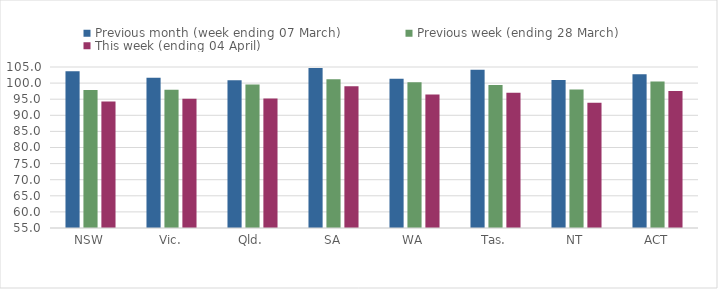
| Category | Previous month (week ending 07 March) | Previous week (ending 28 March) | This week (ending 04 April) |
|---|---|---|---|
| NSW | 103.678 | 97.855 | 94.265 |
| Vic. | 101.642 | 97.944 | 95.146 |
| Qld. | 100.861 | 99.578 | 95.232 |
| SA | 104.658 | 101.191 | 99.039 |
| WA | 101.36 | 100.258 | 96.485 |
| Tas. | 104.149 | 99.407 | 97.036 |
| NT | 100.994 | 98.011 | 93.923 |
| ACT | 102.773 | 100.52 | 97.574 |